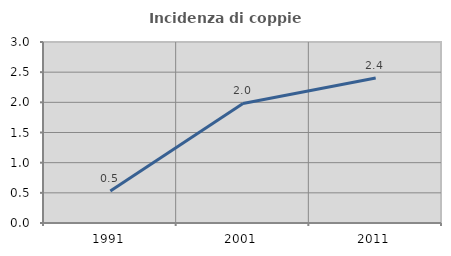
| Category | Incidenza di coppie miste |
|---|---|
| 1991.0 | 0.532 |
| 2001.0 | 1.982 |
| 2011.0 | 2.402 |